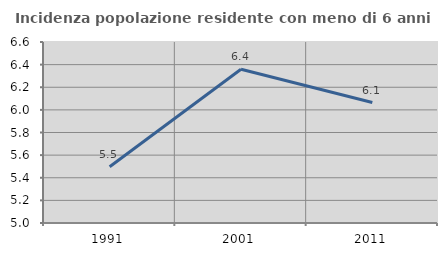
| Category | Incidenza popolazione residente con meno di 6 anni |
|---|---|
| 1991.0 | 5.498 |
| 2001.0 | 6.359 |
| 2011.0 | 6.065 |